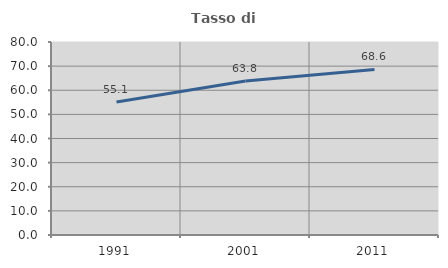
| Category | Tasso di occupazione   |
|---|---|
| 1991.0 | 55.141 |
| 2001.0 | 63.849 |
| 2011.0 | 68.641 |